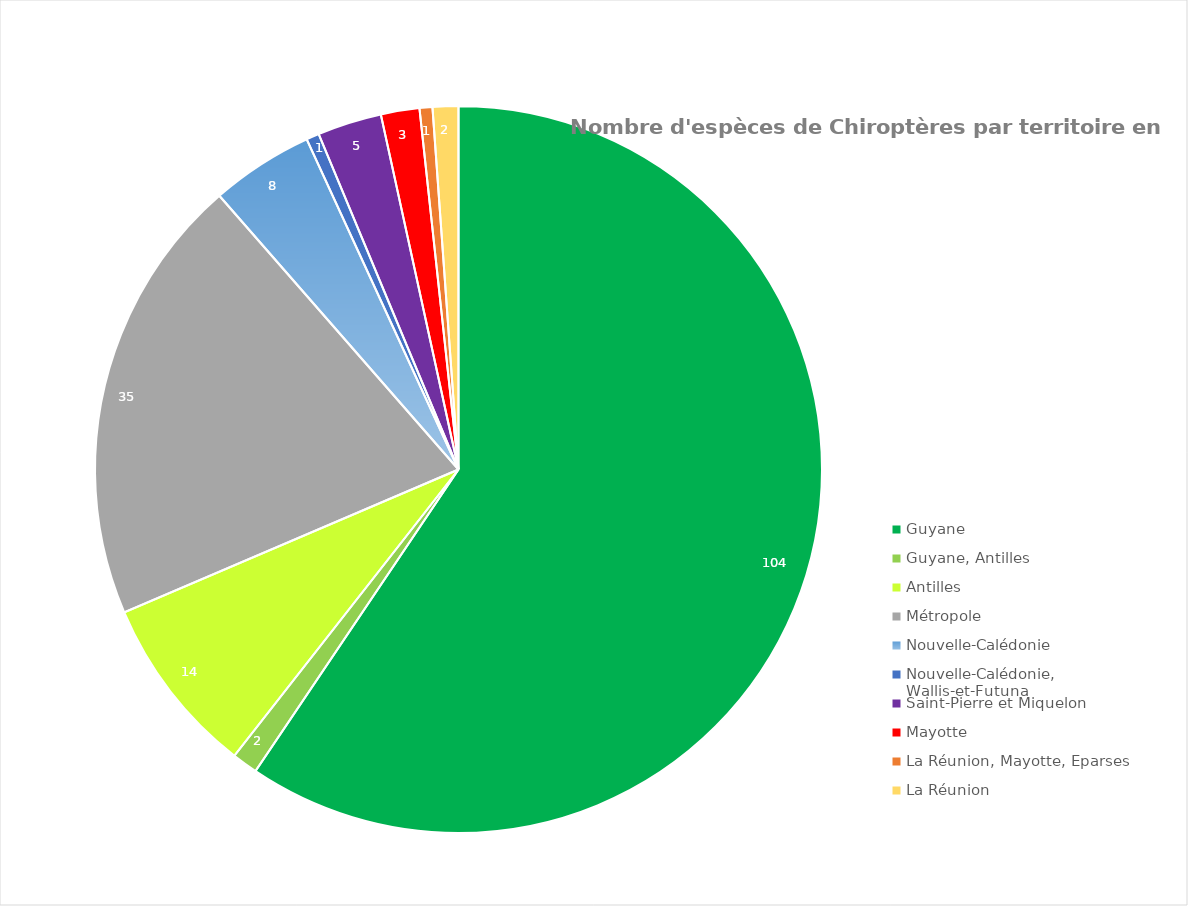
| Category | Series 0 |
|---|---|
| Guyane | 104 |
| Guyane, Antilles | 2 |
| Antilles | 14 |
| Métropole | 35 |
| Nouvelle-Calédonie | 8 |
| Nouvelle-Calédonie, Wallis-et-Futuna | 1 |
| Saint-Pierre et Miquelon | 5 |
| Mayotte | 3 |
| La Réunion, Mayotte, Eparses | 1 |
| La Réunion | 2 |